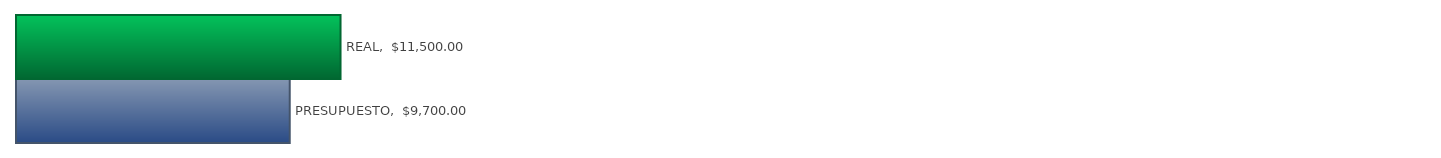
| Category | Series 0 |
|---|---|
| PRESUPUESTO | 9700 |
| REAL | 11500 |